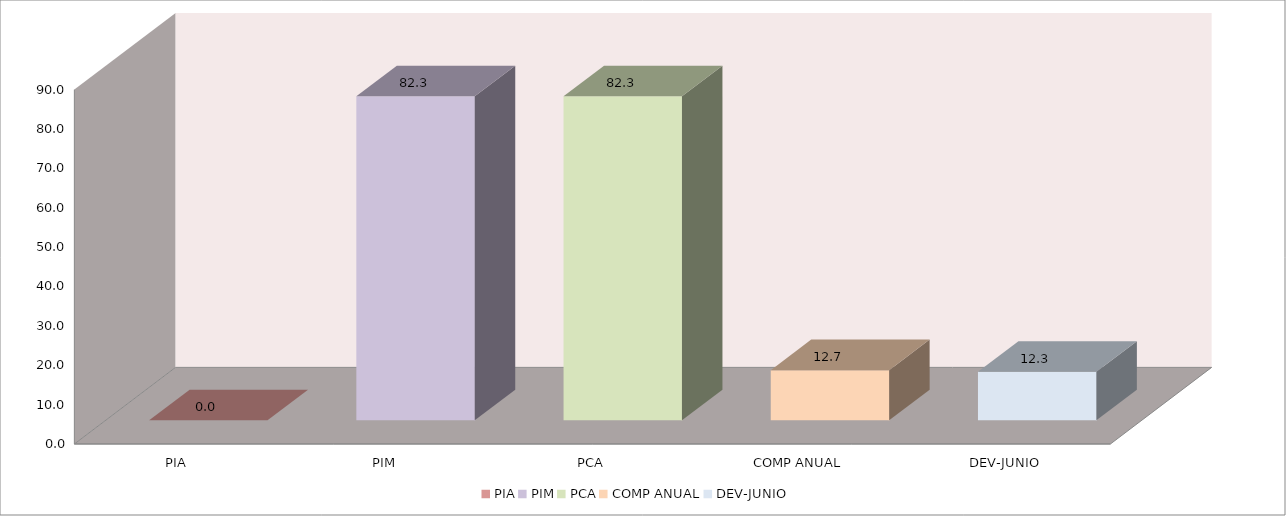
| Category | 011 MINISTERIO DE SALUD |
|---|---|
| PIA | 0 |
| PIM | 82.281 |
| PCA | 82.281 |
| COMP ANUAL | 12.746 |
| DEV-JUNIO | 12.329 |